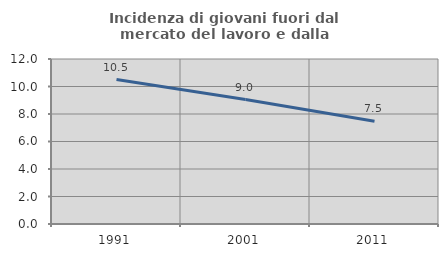
| Category | Incidenza di giovani fuori dal mercato del lavoro e dalla formazione  |
|---|---|
| 1991.0 | 10.507 |
| 2001.0 | 9.05 |
| 2011.0 | 7.477 |